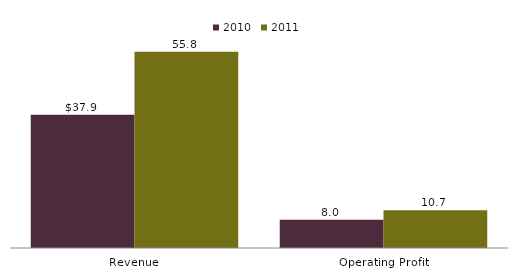
| Category | 2010 | 2011 |
|---|---|---|
| Revenue | 37.9 | 55.8 |
| Operating Profit | 8 | 10.7 |